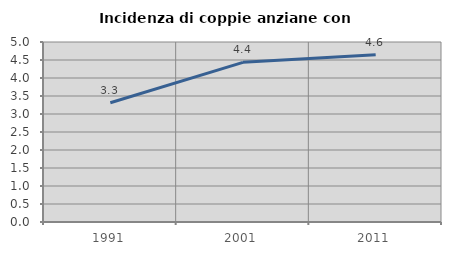
| Category | Incidenza di coppie anziane con figli |
|---|---|
| 1991.0 | 3.314 |
| 2001.0 | 4.436 |
| 2011.0 | 4.645 |